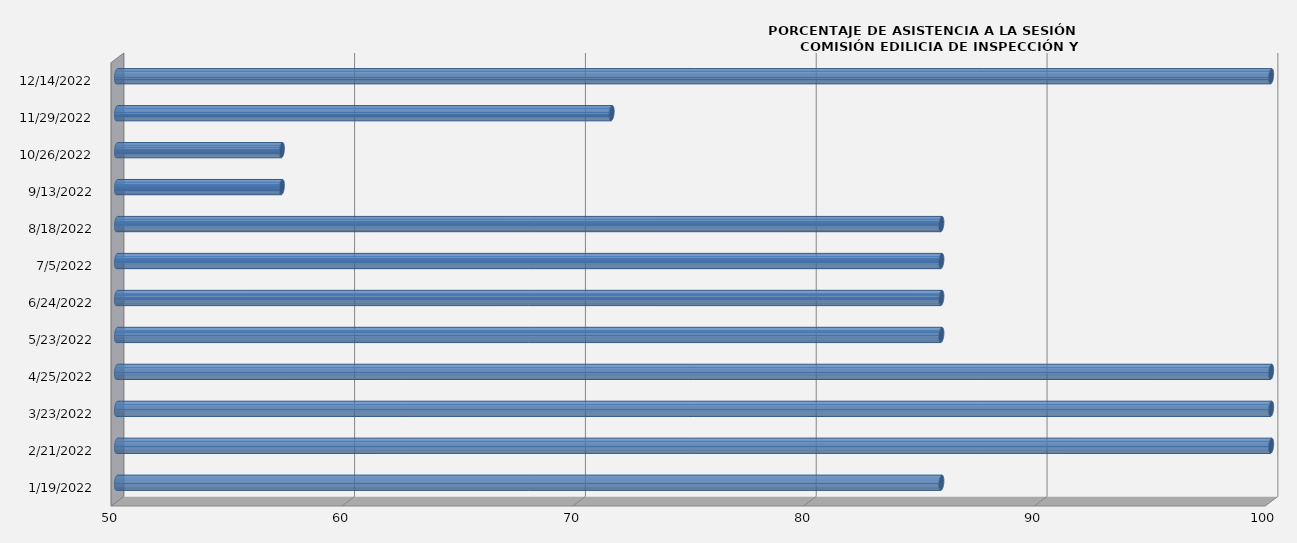
| Category | Series 0 |
|---|---|
| 1/19/22 | 85.714 |
| 2/21/22 | 100 |
| 3/23/22 | 100 |
| 4/25/22 | 100 |
| 5/23/22 | 85.714 |
| 6/24/22 | 85.714 |
| 7/5/22 | 85.714 |
| 8/18/22 | 85.714 |
| 9/13/22 | 57.143 |
| 10/26/22 | 57.143 |
| 11/29/22 | 71.429 |
| 12/14/22 | 100 |